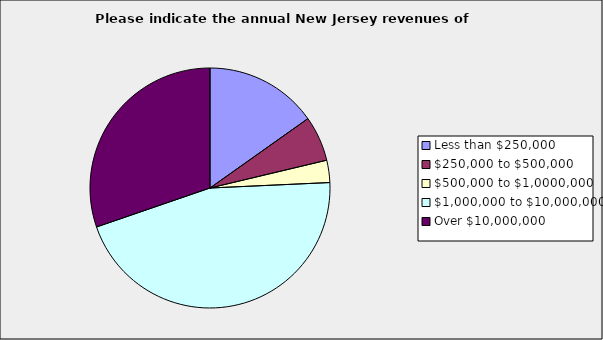
| Category | Series 0 |
|---|---|
| Less than $250,000 | 0.152 |
| $250,000 to $500,000 | 0.061 |
| $500,000 to $1,0000,000 | 0.03 |
| $1,000,000 to $10,000,000 | 0.455 |
| Over $10,000,000 | 0.303 |